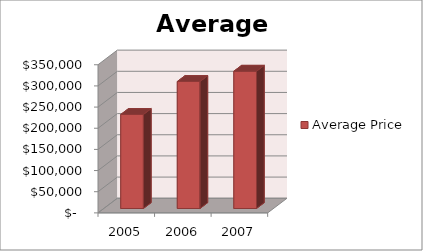
| Category | Average Price |
|---|---|
| 2005.0 | 222200 |
| 2006.0 | 300100 |
| 2007.0 | 324400 |